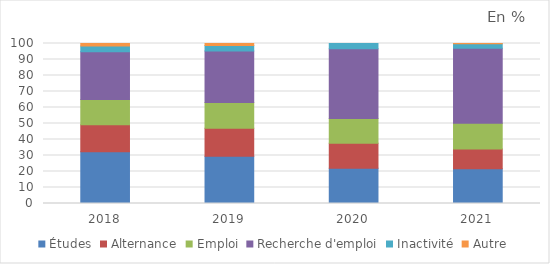
| Category | Études | Alternance | Emploi | Recherche d'emploi | Inactivité | Autre |
|---|---|---|---|---|---|---|
| 2018.0 | 32.4 | 16.8 | 15.8 | 29.8 | 3.7 | 1.5 |
| 2019.0 | 29.6 | 17.4 | 16.2 | 32.1 | 3.4 | 1.3 |
| 2020.0 | 22.1 | 15.5 | 15.5 | 43.6 | 3.3 | 0 |
| 2021.0 | 21.7 | 12.3 | 16.2 | 46.8 | 2.9 | 0.1 |